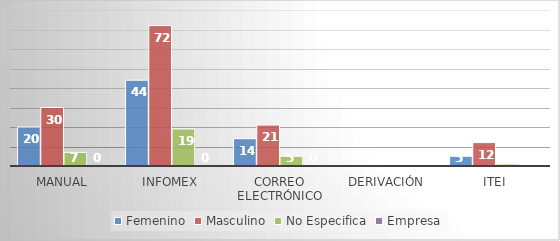
| Category | Femenino | Masculino | No Especifica | Empresa |
|---|---|---|---|---|
| Manual | 20 | 30 | 7 | 0 |
| Infomex | 44 | 72 | 19 | 0 |
| Correo Electrónico | 14 | 21 | 5 | 0 |
| Derivación | 0 | 0 | 0 | 0 |
| ITEI | 5 | 12 | 1 | 0 |